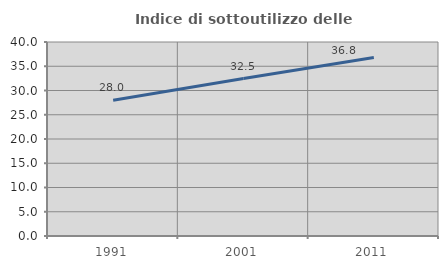
| Category | Indice di sottoutilizzo delle abitazioni  |
|---|---|
| 1991.0 | 28 |
| 2001.0 | 32.46 |
| 2011.0 | 36.8 |